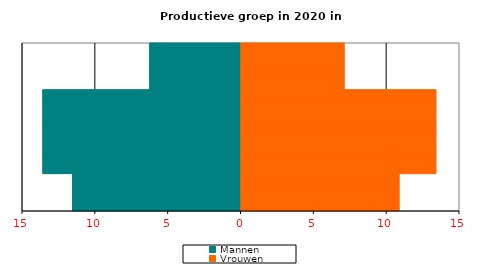
| Category | Mannen | Vrouwen |
|---|---|---|
| 0-5 | -11.567 | 10.893 |
| 5-10 | -11.567 | 10.893 |
| 10-15 | -11.567 | 10.893 |
| 15-20 | -11.567 | 10.893 |
| 20-25 | -13.6 | 13.424 |
| 25-30 | -13.6 | 13.424 |
| 30-35 | -13.6 | 13.424 |
| 35-40 | -13.6 | 13.424 |
| 40-45 | -13.6 | 13.424 |
| 45-50 | -13.6 | 13.424 |
| 50-55 | -13.6 | 13.424 |
| 55-60 | -13.6 | 13.424 |
| 60-65 | -13.6 | 13.424 |
| 65-70 | -6.266 | 7.123 |
| 70-75 | -6.266 | 7.123 |
| 75-80 | -6.266 | 7.123 |
| 80-85 | -6.266 | 7.123 |
| 85-90 | -6.266 | 7.123 |